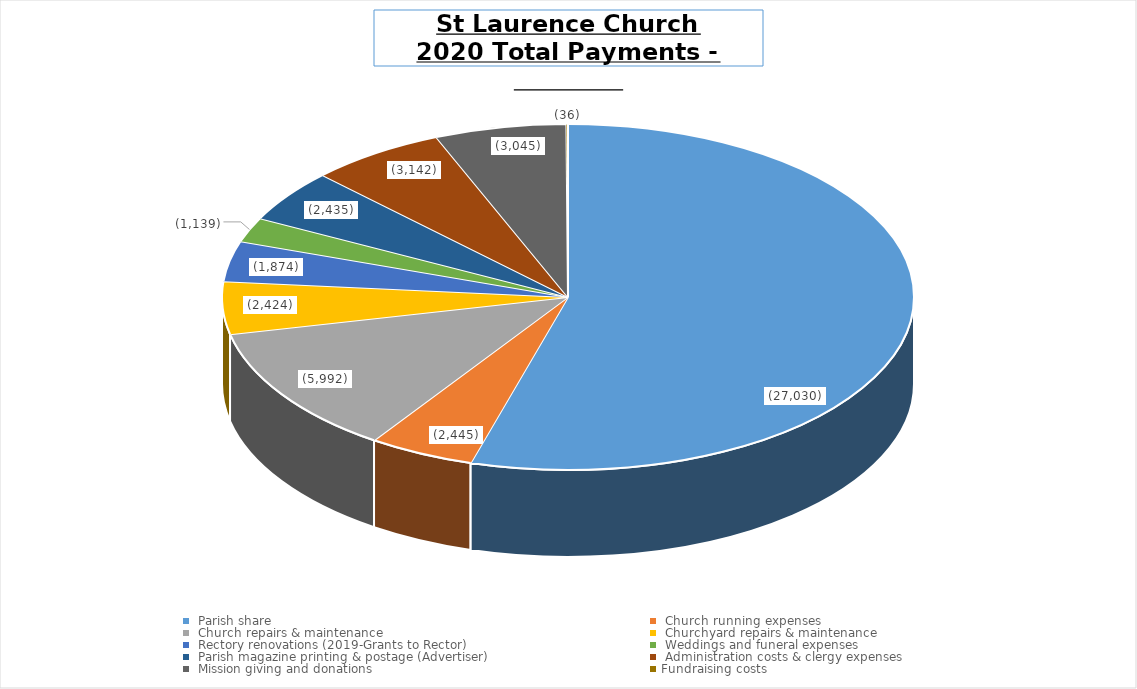
| Category | Series 0 | Series 1 | Series 2 | Series 3 | Series 4 | Series 5 |
|---|---|---|---|---|---|---|
|  Parish share  |  |  |  |  |  | -27029.97 |
|  Church running expenses  |  |  |  |  |  | -2445.42 |
|  Church repairs & maintenance  |  |  |  |  |  | -5991.73 |
|  Churchyard repairs & maintenance  |  |  |  |  |  | -2424 |
|  Rectory renovations (2019-Grants to Rector)  |  |  |  |  |  | -1874 |
|  Weddings and funeral expenses  |  |  |  |  |  | -1139 |
|  Parish magazine printing & postage (Advertiser)  |  |  |  |  |  | -2434.77 |
|  Administration costs & clergy expenses  |  |  |  |  |  | -3142.48 |
|  Mission giving and donations  |  |  |  |  |  | -3045 |
| Fundraising costs |  |  |  |  |  | -36 |